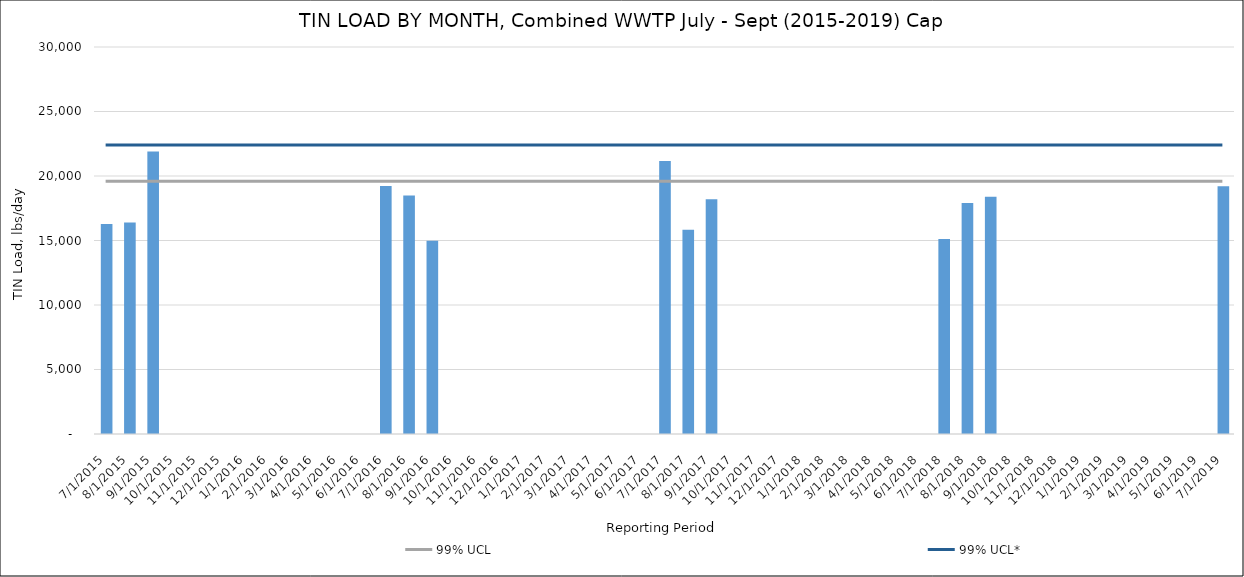
| Category | Series 0 |
|---|---|
| 7/31/15 | 16287.214 |
| 8/31/15 | 16393.016 |
| 9/30/15 | 21900.907 |
| 7/31/16 | 19228.082 |
| 8/31/16 | 18489.96 |
| 9/30/16 | 14984.572 |
| 7/31/17 | 21158.193 |
| 8/31/17 | 15831.48 |
| 9/30/17 | 18200.295 |
| 7/31/18 | 15107.676 |
| 8/31/18 | 17910.344 |
| 9/30/18 | 18385.659 |
| 7/31/19 | 19212.077 |